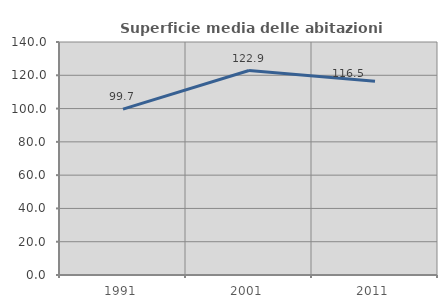
| Category | Superficie media delle abitazioni occupate |
|---|---|
| 1991.0 | 99.676 |
| 2001.0 | 122.864 |
| 2011.0 | 116.487 |